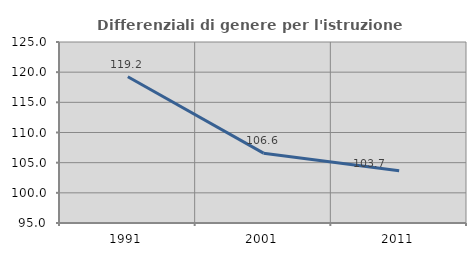
| Category | Differenziali di genere per l'istruzione superiore |
|---|---|
| 1991.0 | 119.249 |
| 2001.0 | 106.573 |
| 2011.0 | 103.67 |